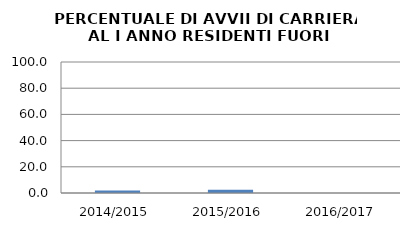
| Category | 2014/2015 2015/2016 2016/2017 |
|---|---|
| 2014/2015 | 1.852 |
| 2015/2016 | 2.5 |
| 2016/2017 | 0 |